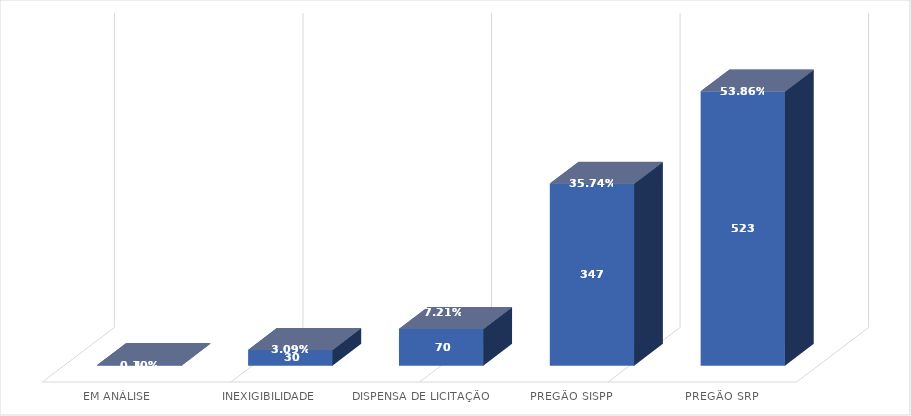
| Category | Soma de Quantidade de itens | Soma de Quantidade de itens2 |
|---|---|---|
| EM ANÁLISE | 1 | 0.001 |
| INEXIGIBILIDADE | 30 | 0.031 |
| DISPENSA DE LICITAÇÃO | 70 | 0.072 |
| PREGÃO SISPP | 347 | 0.357 |
| PREGÃO SRP | 523 | 0.539 |